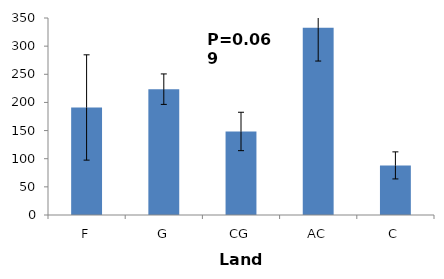
| Category | Series 0 |
|---|---|
| F | 191.032 |
| G | 223.574 |
| CG | 148.411 |
| AC | 332.589 |
| C | 88.117 |